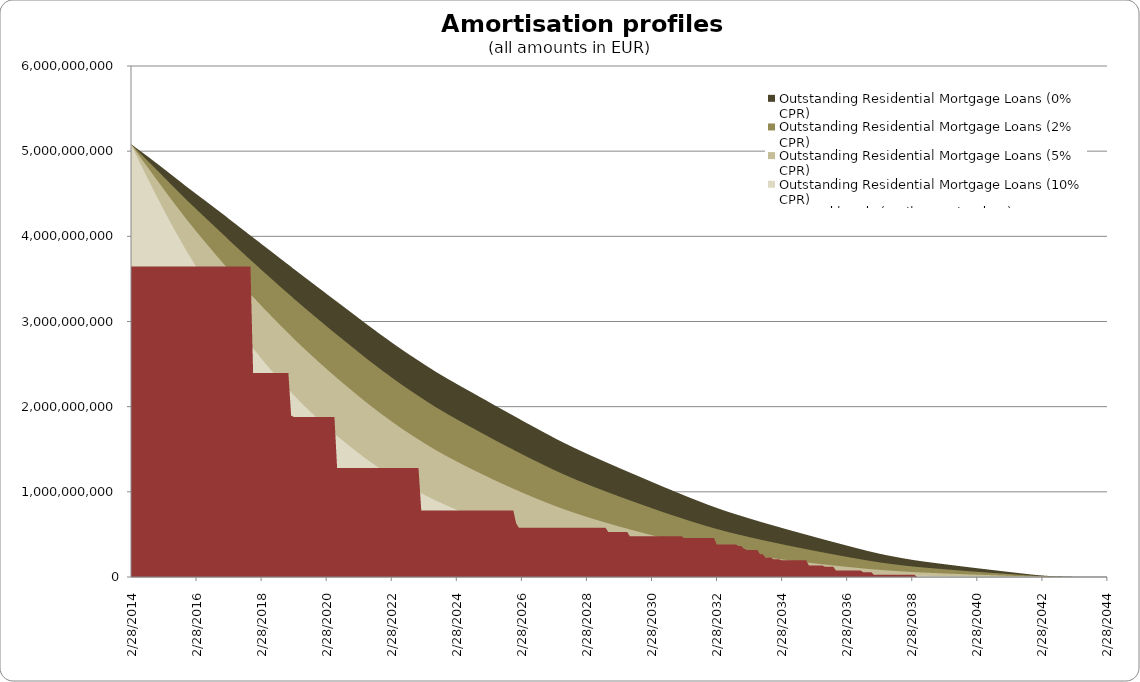
| Category | Outstanding Residential Mortgage Loans (0% CPR) | Outstanding Residential Mortgage Loans (2% CPR) | Outstanding Residential Mortgage Loans (5% CPR) | Outstanding Residential Mortgage Loans (10% CPR) | Covered bonds (until maturity date) |
|---|---|---|---|---|---|
| 2/28/14 | 5082942700.84 | 5082942700.84 | 5082942700.84 | 5082942700.84 | 3645000000 |
| 3/31/14 | 5059502535.826 | 5050991729.052 | 5037922143.529 | 5015274332.804 | 3645000000 |
| 4/30/14 | 5035281087.092 | 5018355211.27 | 4992418533.778 | 4947632926.053 | 3645000000 |
| 5/31/14 | 5011285603.222 | 4986039021.974 | 4947434528.206 | 4881010954.826 | 3645000000 |
| 6/30/14 | 4988150014.239 | 4954671481.758 | 4903588755.282 | 4816005889.536 | 3645000000 |
| 7/31/14 | 4964336653.181 | 4922723269.973 | 4859363570.341 | 4751115673.47 | 3645000000 |
| 8/31/14 | 4940842955.15 | 4891184973.503 | 4815738010.068 | 4687295189.592 | 3645000000 |
| 9/30/14 | 4917259857.171 | 4859650494.586 | 4772309431.669 | 4624143364.083 | 3645000000 |
| 10/31/14 | 4891837571.508 | 4826393687.946 | 4727386358.92 | 4560023015.857 | 3645000000 |
| 11/30/14 | 4867666459.412 | 4794467372.243 | 4683963638.098 | 4497826452.979 | 3645000000 |
| 12/31/14 | 4843360567.525 | 4762502280.533 | 4640696198.778 | 4436245375.859 | 3645000000 |
| 1/31/15 | 4818585558.343 | 4730170652.226 | 4597265071.046 | 4374971301.744 | 3645000000 |
| 2/28/15 | 4794882189.392 | 4698984526.424 | 4555138070.332 | 4315393970.453 | 3645000000 |
| 3/31/15 | 4770643957.789 | 4667366652.986 | 4512780848.197 | 4256046759.204 | 3645000000 |
| 4/30/15 | 4745654663.77 | 4635108287.786 | 4469994651.805 | 4196743173.478 | 3645000000 |
| 5/31/15 | 4720504187.506 | 4602788077.687 | 4427340178.051 | 4138009883.588 | 3645000000 |
| 6/30/15 | 4695635890.399 | 4570838167.52 | 4385231776.73 | 4080227940.161 | 3645000000 |
| 7/31/15 | 4670676207.111 | 4538893913.978 | 4343317059.092 | 4023061290.3 | 3645000000 |
| 8/31/15 | 4645601096.726 | 4506932212.853 | 4301573239.839 | 3966483747.097 | 3645000000 |
| 9/30/15 | 4620162576.696 | 4474713228.848 | 4259771442.784 | 3910280367.37 | 3645000000 |
| 10/31/15 | 4594717519.586 | 4442583564.598 | 4218241983.476 | 3854751017.992 | 3645000000 |
| 11/30/15 | 4570021427.967 | 4411272282.862 | 4177673964.944 | 3800516544.794 | 3645000000 |
| 12/31/15 | 4545985293.916 | 4380689731.853 | 4137975999.32 | 3747479735.752 | 3645000000 |
| 1/31/16 | 4522037053.219 | 4350282140.718 | 4098620341.845 | 3695151583.996 | 3645000000 |
| 2/29/16 | 4498120890.365 | 4319995262.623 | 4059554081.064 | 3643477912.199 | 3645000000 |
| 3/31/16 | 4474372137.292 | 4289958477.967 | 4020896959.711 | 3592559713.094 | 3645000000 |
| 4/30/16 | 4450592835.087 | 4259981278.537 | 3982468416.519 | 3542228995.983 | 3645000000 |
| 5/31/16 | 4426799076.137 | 4230078977.879 | 3944281659.935 | 3492492289.609 | 3645000000 |
| 6/30/16 | 4402882541.416 | 4200148103.167 | 3906239279.581 | 3443258441.138 | 3645000000 |
| 7/31/16 | 4378186574.345 | 4169563663.639 | 3867761104.014 | 3394014255.098 | 3645000000 |
| 8/31/16 | 4353879960.064 | 4139440408.961 | 3829882600.224 | 3345667085.675 | 3645000000 |
| 9/30/16 | 4329561764.112 | 4109395707.571 | 3792246714.17 | 3297897005.578 | 3645000000 |
| 10/31/16 | 4305246448.666 | 4079443100.554 | 3754864719.96 | 3250708611.803 | 3645000000 |
| 11/30/16 | 4281146619.941 | 4049783477.246 | 3717919762.633 | 3204254493.932 | 3645000000 |
| 12/31/16 | 4256918379.91 | 4020090826.008 | 3681110618.996 | 3158268866.889 | 3645000000 |
| 1/31/17 | 4232304644.921 | 3990123175.259 | 3644215909.341 | 3112558857.45 | 3645000000 |
| 2/28/17 | 4207166236.234 | 3959751149.521 | 3607119122.341 | 3067024177.801 | 3645000000 |
| 3/31/17 | 4182793767.362 | 3930189694.366 | 3570926392.227 | 3022601234.265 | 3645000000 |
| 4/30/17 | 4158247149.837 | 3900553134.858 | 3534828744.632 | 2978595833.054 | 3645000000 |
| 5/31/17 | 4133690504.04 | 3870995766.353 | 3498965580.359 | 2935121692.607 | 3645000000 |
| 6/30/17 | 4109010117.195 | 3841411120.944 | 3463239747.217 | 2892092912.744 | 3645000000 |
| 7/31/17 | 4084345184.216 | 3811929473.267 | 3427767993.637 | 2849602907.363 | 3645000000 |
| 8/31/17 | 4059751473.946 | 3782602503.872 | 3392595349.603 | 2807684021.216 | 3645000000 |
| 9/30/17 | 4034085317.271 | 3752365860.673 | 3356768003.914 | 2765545046.161 | 3645000000 |
| 10/31/17 | 4009989252.924 | 3723678225.759 | 3322485469.616 | 2724995206.285 | 3645000000 |
| 11/30/17 | 3985685824.072 | 3694884251.662 | 3288263240.714 | 2684803292.328 | 2395000000 |
| 12/31/17 | 3961289545.43 | 3666090683.344 | 3254196224.229 | 2645043830.162 | 2395000000 |
| 1/31/18 | 3936896882.748 | 3637386870.014 | 3220362957.701 | 2605776725.416 | 2395000000 |
| 2/28/18 | 3912645200.657 | 3608899287.948 | 3186873934.754 | 2567086512.239 | 2395000000 |
| 3/31/18 | 3888437018.644 | 3580537308.161 | 3153647287.61 | 2528901895.132 | 2395000000 |
| 4/30/18 | 3864256143.3 | 3552285636.8 | 3120668157.426 | 2491206304.859 | 2395000000 |
| 5/31/18 | 3839937837.99 | 3523992756.119 | 3087802474.572 | 2453888686.629 | 2395000000 |
| 6/30/18 | 3815094331.622 | 3495303834.99 | 3054739858.507 | 2416700438.041 | 2395000000 |
| 7/31/18 | 3790603362.186 | 3467023900.202 | 3022184181.423 | 2380196209.031 | 2395000000 |
| 8/31/18 | 3764578363.17 | 3437428499.917 | 2988632810.872 | 2343190689.27 | 2395000000 |
| 9/30/18 | 3740095116.616 | 3409328259.305 | 2956531422.395 | 2307601506.667 | 2395000000 |
| 10/31/18 | 3715844044.433 | 3381524115.76 | 2924832257.137 | 2272597479.662 | 2395000000 |
| 11/30/18 | 3691254161.748 | 3353496056.331 | 2893084167.699 | 2237823695.622 | 2395000000 |
| 12/31/18 | 3667078057.508 | 3325928007.285 | 2861876624.387 | 2203732865.251 | 2395000000 |
| 1/31/19 | 3642210038.876 | 3297816727.457 | 2830344983.916 | 2169654875.586 | 1895000000 |
| 2/28/19 | 3617795469.021 | 3270200491.385 | 2799381131.716 | 2136272035.649 | 1880000000 |
| 3/31/19 | 3593625821.244 | 3242888850.278 | 2768818637.533 | 2103450400.458 | 1880000000 |
| 4/30/19 | 3569445246.563 | 3215649997.045 | 2738457547.603 | 2071033009.343 | 1880000000 |
| 5/31/19 | 3545063931.704 | 3188313066.387 | 2708151733.264 | 2038906187.251 | 1880000000 |
| 6/30/19 | 3520761058.862 | 3161129434.951 | 2678114295.909 | 2007227505.615 | 1880000000 |
| 7/31/19 | 3496629896.065 | 3134182147.1 | 2648413884.282 | 1976043903.976 | 1880000000 |
| 8/31/19 | 3472239582.916 | 3107084677.333 | 2618722662.677 | 1945106937.058 | 1880000000 |
| 9/30/19 | 3448107425.959 | 3080300120.512 | 2589430412.73 | 1914703196.522 | 1880000000 |
| 10/31/19 | 3423843670.689 | 3053479519.613 | 2560241997.342 | 1884609940.689 | 1880000000 |
| 11/30/19 | 3399166313.787 | 3026372194.605 | 2530947508.038 | 1854670826.986 | 1880000000 |
| 12/31/19 | 3375014769.529 | 2999814782.603 | 2502246179.799 | 1825395520.057 | 1880000000 |
| 1/31/20 | 3351044030.438 | 2973498591.078 | 2473877127.622 | 1796587247.149 | 1880000000 |
| 2/29/20 | 3327102636.603 | 2947288441.589 | 2445726128.766 | 1768158742.318 | 1880000000 |
| 3/31/20 | 3302346153.569 | 2920437228.071 | 2417173659.703 | 1739660587.884 | 1880000000 |
| 4/30/20 | 3278440162.835 | 2894418881.009 | 2389440132.938 | 1711969675.112 | 1880000000 |
| 5/31/20 | 3254556605.46 | 2868499574.533 | 2361915497.614 | 1684641561.78 | 1880000000 |
| 6/30/20 | 3230649406.775 | 2842638478.775 | 2334565108.014 | 1657648281.463 | 1280000000 |
| 7/31/20 | 3206597381.28 | 2816729052.238 | 2307300854.356 | 1630924537.158 | 1280000000 |
| 8/31/20 | 3182398605.786 | 2790770055.616 | 2280121567.002 | 1604467352.796 | 1280000000 |
| 9/30/20 | 3158398623.847 | 2765064460.223 | 2253273984.541 | 1578447445.656 | 1280000000 |
| 10/31/20 | 3134384617.509 | 2739425190.592 | 2226603984.732 | 1552752894.655 | 1280000000 |
| 11/30/20 | 3110152779.408 | 2713674291.255 | 2199966419.227 | 1527279980.836 | 1280000000 |
| 12/31/20 | 3085563891.751 | 2687691267.496 | 2173264099.216 | 1501959960.272 | 1280000000 |
| 1/31/21 | 3061819254.018 | 2662522126.526 | 2147341640.51 | 1477373270.327 | 1280000000 |
| 2/28/21 | 3038223104.342 | 2637558963.721 | 2121704470.872 | 1453172683.2 | 1280000000 |
| 3/31/21 | 3014928299.821 | 2612933416.846 | 2096456481.455 | 1429425178.992 | 1280000000 |
| 4/30/21 | 2989462188.007 | 2586504621.737 | 2069881876.617 | 1404961359.051 | 1280000000 |
| 5/31/21 | 2965686411.513 | 2561617379.514 | 2044661211.392 | 1381603479.756 | 1280000000 |
| 6/30/21 | 2942074574.954 | 2536947910.951 | 2019730582.839 | 1358622315.545 | 1280000000 |
| 7/31/21 | 2918274824.382 | 2512192423.446 | 1994846977.726 | 1335851340.695 | 1280000000 |
| 8/31/21 | 2895220096.663 | 2488153314.951 | 1970646003.047 | 1313712711.277 | 1280000000 |
| 9/30/21 | 2870468529.755 | 2462732161.497 | 1945465149.735 | 1291095843.378 | 1280000000 |
| 10/31/21 | 2847429580.42 | 2438856366.153 | 1921619031.7 | 1269537580.558 | 1280000000 |
| 11/30/21 | 2824693596.465 | 2415312985.038 | 1898144531.926 | 1248391463.841 | 1280000000 |
| 12/31/21 | 2802379041.933 | 2392201656.568 | 1875117307.976 | 1227702661.234 | 1280000000 |
| 1/31/22 | 2779350128.97 | 2368552471.638 | 1851776039.892 | 1206969947.858 | 1280000000 |
| 2/28/22 | 2757108738.119 | 2345646076.555 | 1829122231.515 | 1186844897.894 | 1280000000 |
| 3/31/22 | 2734773352.348 | 2322730209.132 | 1806565892.395 | 1166939357.538 | 1280000000 |
| 4/30/22 | 2712216178.292 | 2299696744.119 | 1784022810.919 | 1147197327.205 | 1280000000 |
| 5/31/22 | 2690058645.309 | 2277072486.759 | 1761900921.21 | 1127878838.98 | 1280000000 |
| 6/30/22 | 2668330968.687 | 2254881087.414 | 1740215630.225 | 1108989087.091 | 1280000000 |
| 7/31/22 | 2646171528.79 | 2232393653.444 | 1718402891.334 | 1090165525.787 | 1280000000 |
| 8/31/22 | 2624544651.362 | 2210424023.485 | 1697088936.195 | 1071803802.317 | 1280000000 |
| 9/30/22 | 2603441877.818 | 2188962652.759 | 1676262990.666 | 1053891957.043 | 1280000000 |
| 10/31/22 | 2582229652.289 | 2167475357.322 | 1655513657.158 | 1036167445.052 | 1280000000 |
| 11/30/22 | 2561195493.624 | 2146203374.239 | 1635024508.001 | 1018743109.593 | 1280000000 |
| 12/31/22 | 2540643417.508 | 2125400113.653 | 1614986464.384 | 1001734304.82 | 1280000000 |
| 1/31/23 | 2519662767.846 | 2104302843.658 | 1594818349.242 | 984777517.826 | 780000000 |
| 2/28/23 | 2499634192.52 | 2084064326.345 | 1575392942.556 | 968409496.188 | 780000000 |
| 3/31/23 | 2479069593.389 | 2063441785.602 | 1555767844.287 | 952046536.246 | 780000000 |
| 4/30/23 | 2458884046.187 | 2043197698.825 | 1536518363.014 | 936039947.987 | 780000000 |
| 5/31/23 | 2438402722.308 | 2022770518.962 | 1517220752.189 | 920128843.491 | 780000000 |
| 6/30/23 | 2417724101.631 | 2002242890.644 | 1497937569.09 | 904350589.937 | 780000000 |
| 7/31/23 | 2398266609.132 | 1982788177.335 | 1479544622.579 | 889230648.355 | 780000000 |
| 8/31/23 | 2379314670.887 | 1963810517.247 | 1461591885.908 | 874491758.066 | 780000000 |
| 9/30/23 | 2360266605.316 | 1944811887.382 | 1443706580.454 | 859907576.971 | 780000000 |
| 10/31/23 | 2341621320.2 | 1926202941.099 | 1426192576.232 | 845657010.668 | 780000000 |
| 11/30/23 | 2322790578.98 | 1907498800.263 | 1408689239.66 | 831523488.579 | 780000000 |
| 12/31/23 | 2304811549.799 | 1889550391.563 | 1391823601.573 | 817874679.225 | 780000000 |
| 1/31/24 | 2286754378.044 | 1871593013.921 | 1375029221.824 | 804373467.369 | 780000000 |
| 2/29/24 | 2268565148.986 | 1853582803.402 | 1358273721.466 | 790999754.918 | 780000000 |
| 3/31/24 | 2250588193.029 | 1835801039.574 | 1341762693.006 | 777871760.408 | 780000000 |
| 4/30/24 | 2232686392.896 | 1818135055.144 | 1325412419.143 | 764938588.578 | 780000000 |
| 5/31/24 | 2214888149.722 | 1800607496.6 | 1309238425.564 | 752207258.858 | 780000000 |
| 6/30/24 | 2197090020.425 | 1783133853.104 | 1293178360.201 | 739640099.36 | 780000000 |
| 7/31/24 | 2179260914.022 | 1765688801.798 | 1277213323.594 | 727224834.775 | 780000000 |
| 8/31/24 | 2161500091.079 | 1748352628.025 | 1261400800.561 | 714992696.004 | 780000000 |
| 9/30/24 | 2143520998.561 | 1730893530.009 | 1245573099.631 | 702847275.607 | 780000000 |
| 10/31/24 | 2125434240.894 | 1713401427.244 | 1229795174.522 | 690824564.98 | 780000000 |
| 11/30/24 | 2107519888.553 | 1696102024.729 | 1214228512.842 | 679013887.543 | 780000000 |
| 12/31/24 | 2089820379.288 | 1679028585.78 | 1198895523.897 | 667425522.839 | 780000000 |
| 1/31/25 | 2072129812.764 | 1662014959.801 | 1183676353.775 | 655990703.577 | 780000000 |
| 2/28/25 | 2054420003.67 | 1645038414.665 | 1168554256.278 | 644698761.677 | 780000000 |
| 3/31/25 | 2035940185.854 | 1627498746.539 | 1153103511.493 | 633314587.594 | 780000000 |
| 4/30/25 | 2018150069.58 | 1610563841.774 | 1138152274.516 | 622292848.45 | 780000000 |
| 5/31/25 | 2000501343.421 | 1593793950.933 | 1123387000.769 | 611458624.967 | 780000000 |
| 6/30/25 | 1982792479.576 | 1577028090.337 | 1108693351.331 | 600748045.747 | 780000000 |
| 7/31/25 | 1965008016.169 | 1560254098.887 | 1094062520.003 | 590155292.519 | 780000000 |
| 8/31/25 | 1947198450.454 | 1543512178.313 | 1079522410.527 | 579694354.006 | 780000000 |
| 9/30/25 | 1929452175.376 | 1526872252.966 | 1065121373.061 | 569389886.356 | 780000000 |
| 10/31/25 | 1912011580.57 | 1510525434.806 | 1050991571.55 | 559310696.219 | 780000000 |
| 11/30/25 | 1894635936.759 | 1494280517.378 | 1036998478.241 | 549383044.929 | 780000000 |
| 12/31/25 | 1876485153.189 | 1477475662.711 | 1022683183.143 | 539363421.146 | 630000000 |
| 1/31/26 | 1858864656.873 | 1461139941.29 | 1008758914.811 | 529628080.515 | 578000000 |
| 2/28/26 | 1841623131.024 | 1445152381.822 | 995139603.994 | 520128760.857 | 578000000 |
| 3/31/26 | 1823747326.84 | 1428717582.768 | 981276845.765 | 510577476.115 | 578000000 |
| 4/30/26 | 1806662937.492 | 1412952935.725 | 967938250.29 | 501373060.618 | 578000000 |
| 5/31/26 | 1789627155.983 | 1397275232.709 | 954721518.842 | 492303922.47 | 578000000 |
| 6/30/26 | 1772244446.357 | 1381375862.823 | 941415638.481 | 483260429.049 | 578000000 |
| 7/31/26 | 1754787177.816 | 1365468013.368 | 928166458.973 | 474317272.02 | 578000000 |
| 8/31/26 | 1737621322.164 | 1349836151.019 | 915166656.858 | 465571621.085 | 578000000 |
| 9/30/26 | 1720167455.332 | 1334029655.964 | 902109823.394 | 456866132.769 | 578000000 |
| 10/31/26 | 1702636958.425 | 1318213190.341 | 889107707.968 | 448257093.625 | 578000000 |
| 11/30/26 | 1685725541.178 | 1302924658.759 | 876521998.043 | 439925217.233 | 578000000 |
| 12/31/26 | 1668904397.624 | 1287753487.547 | 864074215.48 | 431728107.587 | 578000000 |
| 1/31/27 | 1651499690.415 | 1272180140.004 | 851415823.366 | 423491051.626 | 578000000 |
| 2/28/27 | 1635210937.046 | 1257513736.295 | 839422560.769 | 415648675.666 | 578000000 |
| 3/31/27 | 1618400880.98 | 1242492854.604 | 827249653.078 | 407779698.248 | 578000000 |
| 4/30/27 | 1602451065.658 | 1228178269.748 | 815603156.452 | 400231389.471 | 578000000 |
| 5/31/27 | 1586547228.333 | 1213943508.472 | 804064262.879 | 392795271.721 | 578000000 |
| 6/30/27 | 1570591693.53 | 1199713672.505 | 792582877.069 | 385445888.789 | 578000000 |
| 7/31/27 | 1555063479.054 | 1185854138.92 | 781399529.178 | 378298934.979 | 578000000 |
| 8/31/27 | 1538672708.318 | 1171381179.114 | 769865588.33 | 371039480.502 | 578000000 |
| 9/30/27 | 1523477015.05 | 1157861829.321 | 759011221.63 | 364163702.143 | 578000000 |
| 10/31/27 | 1508321758.362 | 1144415328.315 | 748255503.866 | 357389362.385 | 578000000 |
| 11/30/27 | 1493421520.896 | 1131203955.915 | 737703702.282 | 350765529.371 | 578000000 |
| 12/31/27 | 1478384272.683 | 1117930185.434 | 727160910.597 | 344198292.699 | 578000000 |
| 1/31/28 | 1463989745.72 | 1105183069.707 | 717009416.727 | 337867399.038 | 578000000 |
| 2/29/28 | 1449399223.801 | 1092327964.593 | 706835709.941 | 331576050.027 | 578000000 |
| 3/31/28 | 1435212835.621 | 1079817041.575 | 696931993.206 | 325460520.839 | 578000000 |
| 4/30/28 | 1420763958.819 | 1067147959.842 | 686972982.26 | 319367568.777 | 578000000 |
| 5/31/28 | 1406695784.94 | 1054803913.394 | 677269541.934 | 313441099.851 | 578000000 |
| 6/30/28 | 1392659507.438 | 1042522252.876 | 667651671.847 | 307600884.779 | 578000000 |
| 7/31/28 | 1378140878.819 | 1029918454.218 | 657873270.018 | 301733216.591 | 578000000 |
| 8/31/28 | 1363895347.786 | 1017557857.359 | 648295948.459 | 296003898.255 | 578000000 |
| 9/30/28 | 1349858810.084 | 1005391592.149 | 638887275.807 | 290396651.154 | 578000000 |
| 10/31/28 | 1336036095.98 | 993422368.918 | 629647840.83 | 284910414.919 | 528000000 |
| 11/30/28 | 1322299420.188 | 981554436.337 | 620515976.509 | 279516092.999 | 528000000 |
| 12/31/28 | 1308137885.102 | 969408773.633 | 611252034.196 | 274105284.249 | 528000000 |
| 1/31/29 | 1294443915.779 | 957647105.891 | 602273376.691 | 268864832.004 | 528000000 |
| 2/28/29 | 1280742190.677 | 945916536.659 | 593356599.217 | 263693456.877 | 528000000 |
| 3/31/29 | 1267137061.067 | 934293944.602 | 584549491.718 | 258611662.743 | 528000000 |
| 4/30/29 | 1253536650.896 | 922711251.794 | 575808887.888 | 253599518.771 | 528000000 |
| 5/31/29 | 1239658908.402 | 910961085.222 | 567005364.166 | 248599625.603 | 528000000 |
| 6/30/29 | 1226065720.919 | 899456591.862 | 558396060.332 | 243724332.579 | 478000000 |
| 7/31/29 | 1212474014.567 | 887989310.815 | 549850556.468 | 238915571.135 | 478000000 |
| 8/31/29 | 1198916812.26 | 876583290.363 | 541383372.096 | 234178997.039 | 478000000 |
| 9/30/29 | 1185377569.398 | 865226240.049 | 532986490.702 | 229510454.383 | 478000000 |
| 10/31/29 | 1171853889.079 | 853916258.124 | 524658358.057 | 224908624.839 | 478000000 |
| 11/30/29 | 1158075812.004 | 842456813.403 | 516278161.079 | 220321312.931 | 478000000 |
| 12/31/29 | 1144166937.719 | 830938515.382 | 507901845.541 | 215772348.951 | 478000000 |
| 1/31/30 | 1130816408.033 | 819861393.361 | 499834388.223 | 211390454.366 | 478000000 |
| 2/28/30 | 1117524496.002 | 808861614.081 | 491852310.483 | 207079543.156 | 478000000 |
| 3/31/30 | 1104266525.516 | 797921047.353 | 483944105.807 | 202834081.604 | 478000000 |
| 4/30/30 | 1090779276.904 | 786849605.857 | 475994363.389 | 198605274.102 | 478000000 |
| 5/31/30 | 1076809036.856 | 775465327.6 | 467893764.063 | 194347727.187 | 478000000 |
| 6/30/30 | 1063395730.308 | 764517524.302 | 460094574.104 | 190249079.227 | 478000000 |
| 7/31/30 | 1050204535.131 | 753763773.592 | 452449093.671 | 186246626.613 | 478000000 |
| 8/31/30 | 1037143344.453 | 743137190.24 | 444916232.75 | 182322466.314 | 478000000 |
| 9/30/30 | 1024105369.285 | 732560831.472 | 437449317.249 | 178456726.437 | 478000000 |
| 10/31/30 | 1010470789.805 | 721591907.496 | 429784251.389 | 174541586.265 | 478000000 |
| 11/30/30 | 997572063.888 | 711182413.003 | 422488260.918 | 170807253.563 | 478000000 |
| 12/31/30 | 984732745.974 | 700848179.057 | 415271743.793 | 167134953.883 | 478000000 |
| 1/31/31 | 971624542.978 | 690355652.411 | 407996193.939 | 163468568.406 | 478000000 |
| 2/28/31 | 958916423.003 | 680180230.199 | 400942436.845 | 159920233.256 | 458000000 |
| 3/31/31 | 945700739.029 | 669677666.583 | 393730112.124 | 156337536.035 | 458000000 |
| 4/30/31 | 933073290.108 | 659624358.131 | 386815878.331 | 152901648.882 | 458000000 |
| 5/31/31 | 920497479.865 | 649639420.189 | 379974780.893 | 149522272.905 | 458000000 |
| 6/30/31 | 907873004.336 | 639651920.887 | 373165001.978 | 146182459.157 | 458000000 |
| 7/31/31 | 895402958.375 | 629804806.194 | 366469606.806 | 142914258.858 | 458000000 |
| 8/31/31 | 883011075.593 | 620043895.097 | 359856392.849 | 139704392.898 | 458000000 |
| 9/30/31 | 870541209.783 | 610259374.036 | 353261281.541 | 136527495.032 | 458000000 |
| 10/31/31 | 858344482.185 | 600697166.551 | 346826249.052 | 133437925.913 | 458000000 |
| 11/30/31 | 846223035.55 | 591217998.06 | 340469972.711 | 130403540.133 | 458000000 |
| 12/31/31 | 834262600.805 | 581881322.802 | 334226115.737 | 127436603.939 | 458000000 |
| 1/31/32 | 822781397.533 | 572908077.966 | 328220501.067 | 124584139.094 | 458000000 |
| 2/29/32 | 811693216.087 | 564236578.863 | 322416151.831 | 121830796.189 | 383000000 |
| 3/31/32 | 800666382.326 | 555635205.043 | 316679609.973 | 119125198.072 | 383000000 |
| 4/30/32 | 789094456.119 | 546683532.889 | 310771463.766 | 116377201.748 | 383000000 |
| 5/31/32 | 777990675.17 | 538084189.574 | 305091540.618 | 113736585.386 | 383000000 |
| 6/30/32 | 767538565.852 | 529962189.311 | 299708882.108 | 111227679.342 | 383000000 |
| 7/31/32 | 757181827.031 | 521931730.854 | 294403672.521 | 108767645.246 | 383000000 |
| 8/31/32 | 747024748.448 | 514064185.709 | 289215566.954 | 106370551.172 | 383000000 |
| 9/30/32 | 736985917.804 | 506302867.324 | 284111948.596 | 104023744.891 | 383000000 |
| 10/31/32 | 727030568.231 | 498623459.795 | 279078650.416 | 101721520.093 | 363000000 |
| 11/30/32 | 717163533.698 | 491028923.135 | 274116877.123 | 99463845.09 | 363000000 |
| 12/31/32 | 707377523.706 | 483513908.743 | 269223190.658 | 97249007.779 | 333000000 |
| 1/31/33 | 697660456.832 | 476069832.76 | 264392391 | 95074687.572 | 318000000 |
| 2/28/33 | 688017232.231 | 468699736.996 | 259625767.748 | 92940924.779 | 318000000 |
| 3/31/33 | 678414867.339 | 461380876.8 | 254910349.834 | 90842673.348 | 318000000 |
| 4/30/33 | 668854217.112 | 454113635.233 | 250246041.147 | 88779541.149 | 318000000 |
| 5/31/33 | 659347674.134 | 446906210.895 | 245637041.902 | 86752656.148 | 318000000 |
| 6/30/33 | 649711732.082 | 439634190.77 | 241014805.735 | 84737546.847 | 268000000 |
| 7/31/33 | 640351605.434 | 432571690.057 | 236529410.643 | 82786696.991 | 268000000 |
| 8/31/33 | 631089902.746 | 425598081.557 | 232114094.407 | 80876092.706 | 228000000 |
| 9/30/33 | 621885070.674 | 418684998.824 | 227752968.189 | 78999789.99 | 228000000 |
| 10/31/33 | 612741296.192 | 411835007.207 | 223447087.853 | 77157799.449 | 228000000 |
| 11/30/33 | 603673043.539 | 405057550.448 | 219201218.967 | 75351402.573 | 208000000 |
| 12/31/33 | 594682662.126 | 398353892.557 | 215015660.076 | 73580326.631 | 208000000 |
| 1/31/34 | 585726585.913 | 391694582.175 | 210874169.908 | 71838664.062 | 208000000 |
| 2/28/34 | 576791618.083 | 385070640.886 | 206771664.051 | 70124394.982 | 196000000 |
| 3/31/34 | 567865529.825 | 378473794.044 | 202703488.478 | 68435677.182 | 196000000 |
| 4/30/34 | 558951227.723 | 371905893.329 | 198670444.508 | 66772533.332 | 196000000 |
| 5/31/34 | 550037808.312 | 365359604.364 | 194668429.552 | 65133341.463 | 196000000 |
| 6/30/34 | 541172482.637 | 358866179.058 | 190713888.917 | 63523350.408 | 196000000 |
| 7/31/34 | 532333946.122 | 352411300.108 | 186798941.471 | 61939647.098 | 196000000 |
| 8/31/34 | 523528336.406 | 345998883.351 | 182925426.637 | 60382575.671 | 196000000 |
| 9/30/34 | 514760374.479 | 339631881.986 | 179094655.289 | 58852297.778 | 196000000 |
| 10/31/34 | 506007267.472 | 333295106.54 | 175298381.281 | 57345843.597 | 196000000 |
| 11/30/34 | 497286213.252 | 326999765.729 | 171542290.147 | 55864830.847 | 196000000 |
| 12/31/34 | 488599840.399 | 320747428.265 | 167826964.388 | 54409190.766 | 136000000 |
| 1/31/35 | 479937877.204 | 314531196.92 | 164148560.574 | 52977425.202 | 136000000 |
| 2/28/35 | 471313662.371 | 308359668.475 | 160511338.258 | 51570664.439 | 136000000 |
| 3/31/35 | 462697154.97 | 302213046.779 | 156904770.913 | 50185286.007 | 136000000 |
| 4/30/35 | 454096370.824 | 296096484.319 | 153331358.953 | 48821877.963 | 136000000 |
| 5/31/35 | 445522303.879 | 290017036.317 | 149794558.661 | 47481319.002 | 136000000 |
| 6/30/35 | 436576023.727 | 283715315.253 | 146160527.341 | 46121144.993 | 121000000 |
| 7/31/35 | 428040680.532 | 277700578.532 | 142691761.541 | 44824155.964 | 121000000 |
| 8/31/35 | 419531179.245 | 271722011.649 | 139258505.452 | 43549000.686 | 121000000 |
| 9/30/35 | 411035891.776 | 265771962.793 | 135856639.312 | 42294176.423 | 121000000 |
| 10/31/35 | 402568736.749 | 259859322.447 | 132490518.508 | 41060832.025 | 77000000 |
| 11/30/35 | 394125071.726 | 253980959.407 | 129158339.042 | 39848193.521 | 77000000 |
| 12/31/35 | 385710967.525 | 248140654.813 | 125861821.009 | 38656580.717 | 77000000 |
| 1/31/36 | 377325912.941 | 242337937.366 | 122600513.388 | 37485642.427 | 77000000 |
| 2/29/36 | 368981484.192 | 236580087.726 | 119377880.609 | 36336222.458 | 77000000 |
| 3/31/36 | 360650259.485 | 230849375.107 | 116184762.123 | 35205322.647 | 77000000 |
| 4/30/36 | 352342250.354 | 225152108.192 | 113024158.213 | 34093664.279 | 77000000 |
| 5/31/36 | 344050711.946 | 219483862.561 | 109893663.493 | 33000330.716 | 77000000 |
| 6/30/36 | 335776722.751 | 213845225.902 | 106793399.185 | 31925175.339 | 77000000 |
| 7/31/36 | 327524282.06 | 208238638.59 | 103724407.056 | 30868326.432 | 77000000 |
| 8/31/36 | 319331823.095 | 202688380.311 | 100698567.151 | 29833118.928 | 57000000 |
| 9/30/36 | 311172456.939 | 197177174.992 | 97707043.705 | 28816715.669 | 57000000 |
| 10/31/36 | 303255606.722 | 191837351.279 | 94815032.203 | 27838065.315 | 57000000 |
| 11/30/36 | 295551267.097 | 186649140.89 | 92012073.522 | 26893660.063 | 57000000 |
| 12/31/36 | 288146067.778 | 181666440.247 | 89324033.051 | 25990621.155 | 25000000 |
| 1/31/37 | 280997050.82 | 176861217.404 | 86736326.025 | 25124220.567 | 25000000 |
| 2/28/37 | 273895771.529 | 172101642.502 | 84183741.018 | 24275212.415 | 25000000 |
| 3/31/37 | 267188302.784 | 167604613.243 | 81771877.381 | 23473725.741 | 25000000 |
| 4/30/37 | 260541850.3 | 163160436.826 | 79397651.126 | 22689710.414 | 25000000 |
| 5/31/37 | 254169290.87 | 158901970.545 | 77125301.186 | 21941252.485 | 25000000 |
| 6/30/37 | 247954319.011 | 154755724.413 | 74918505.845 | 21217630.845 | 25000000 |
| 7/31/37 | 241795157.208 | 150657751.942 | 72745923.504 | 20509717.84 | 25000000 |
| 8/31/37 | 235748474.09 | 146643093.656 | 70624207.441 | 19822017.429 | 25000000 |
| 9/30/37 | 229773152.757 | 142685830.158 | 68540554.605 | 19150720.753 | 25000000 |
| 10/31/37 | 223875002.635 | 138789306.665 | 66496313.483 | 18496021.462 | 25000000 |
| 11/30/37 | 218063845.771 | 134959328.393 | 64493993.006 | 17858429.364 | 25000000 |
| 12/31/37 | 212586868.556 | 131348318.009 | 62605958.207 | 17257699.523 | 25000000 |
| 1/31/38 | 207340011.888 | 127891016.619 | 60800336.776 | 16684625.461 | 25000000 |
| 2/28/38 | 202276591.762 | 124557931.458 | 59062540.966 | 16134884.025 | 25000000 |
| 3/31/38 | 197346447.146 | 121317628.374 | 57377212.543 | 15604016.818 | 25000000 |
| 4/30/38 | 192562495.339 | 118177594.1 | 55747509.822 | 15092656.135 | 0 |
| 5/31/38 | 187928827.058 | 115139855.837 | 54173987.581 | 14600719.218 | 0 |
| 6/30/38 | 183454518.354 | 112209474.95 | 52658616.721 | 14128502.618 | 0 |
| 7/31/38 | 179128653.885 | 109379269.763 | 51197615.011 | 13674758.463 | 0 |
| 8/31/38 | 174983035.223 | 106668144.844 | 49799415.723 | 13241507.323 | 0 |
| 9/30/38 | 170881238.566 | 103992500.038 | 48424630.92 | 12818072.893 | 0 |
| 10/31/38 | 166801410.35 | 101338901.812 | 47066866.706 | 12402663.15 | 0 |
| 11/30/38 | 162745795.839 | 98708622.894 | 45726607.488 | 11995321.285 | 0 |
| 12/31/38 | 158568065.075 | 96012964.83 | 44362760.564 | 11585231.311 | 0 |
| 1/31/39 | 154559728.304 | 93428491.923 | 43056905.679 | 11193662.356 | 0 |
| 2/28/39 | 150567892.196 | 90862399.914 | 41765960.614 | 10809238.566 | 0 |
| 3/31/39 | 146582340.538 | 88308462.603 | 40486980.583 | 10431127.697 | 0 |
| 4/30/39 | 142601302.01 | 85765574.786 | 39219392.529 | 10059119.658 | 0 |
| 5/31/39 | 138621507.471 | 83231738.916 | 37962221.9 | 9692905.414 | 0 |
| 6/30/39 | 134646917.064 | 80709304.37 | 36716481.243 | 9332685.894 | 0 |
| 7/31/39 | 130692962.049 | 78207468.854 | 35486279.879 | 8979441.229 | 0 |
| 8/31/39 | 126759794.648 | 75726240.351 | 34271525.203 | 8633074.941 | 0 |
| 9/30/39 | 122834479.011 | 73257820.959 | 33068601.379 | 8292608.251 | 0 |
| 10/31/39 | 118928973.877 | 70809286.711 | 31880626.285 | 7958759.994 | 0 |
| 11/30/39 | 115050570.302 | 68384891.684 | 30709417.763 | 7631912.601 | 0 |
| 12/31/39 | 111201571.684 | 65985901.178 | 29555435.729 | 7312104.939 | 0 |
| 1/31/40 | 107375146.682 | 63608160.499 | 28416713.276 | 6998776.701 | 0 |
| 2/29/40 | 103570982.53 | 61251397.463 | 27293033.291 | 6691806.006 | 0 |
| 3/31/40 | 99776627.077 | 58908174.306 | 26180995.821 | 6390295.454 | 0 |
| 4/30/40 | 95988730.782 | 56576468.24 | 25079635.806 | 6093955.057 | 0 |
| 5/31/40 | 92217622.666 | 54262318.388 | 23991562.461 | 5803363.811 | 0 |
| 6/30/40 | 88456633.049 | 51961737.802 | 22914935.993 | 5518018.534 | 0 |
| 7/31/40 | 84710761.542 | 49677609.323 | 21850957.033 | 5238153.388 | 0 |
| 8/31/40 | 80974693.177 | 47406757.526 | 20798155.522 | 4963360.418 | 0 |
| 9/30/40 | 77241265.954 | 45144948.666 | 19754613.039 | 4693131.893 | 0 |
| 10/31/40 | 73513797.752 | 42894091.98 | 18721111.805 | 4427607.463 | 0 |
| 11/30/40 | 69793824.729 | 40655046.052 | 17697968.198 | 4166814.104 | 0 |
| 12/31/40 | 66082125.877 | 38428223.155 | 16685301.237 | 3910731.553 | 0 |
| 1/31/41 | 62373748.254 | 36210705.057 | 15681785.985 | 3659002.627 | 0 |
| 2/28/41 | 58679952.077 | 34008989.487 | 14690178.206 | 3412223.78 | 0 |
| 3/31/41 | 54996348.022 | 31820475.758 | 13709284.829 | 3170067.32 | 0 |
| 4/30/41 | 51325277.427 | 29646468.151 | 12739602.78 | 2932599.887 | 0 |
| 5/31/41 | 47666237.358 | 27486621.85 | 11780916.719 | 2699723.307 | 0 |
| 6/30/41 | 44006918.905 | 25333797.723 | 10830108.595 | 2470678.424 | 0 |
| 7/31/41 | 40364190.476 | 23197672.989 | 9891262.515 | 2246354.952 | 0 |
| 8/31/41 | 36744592.226 | 21081933.874 | 8965872.273 | 2027040.563 | 0 |
| 9/30/41 | 33161193.076 | 18993981.089 | 8056991.336 | 1813368.344 | 0 |
| 10/31/41 | 29724697.069 | 16996994.393 | 7191240.615 | 1611239.867 | 0 |
| 11/30/41 | 26470789.907 | 15110903.572 | 6376713.679 | 1422317.445 | 0 |
| 12/31/41 | 23445842.222 | 13361592.125 | 5623924.585 | 1248769.682 | 0 |
| 1/31/42 | 20605292.501 | 11723033.227 | 4921483.883 | 1087882.937 | 0 |
| 2/28/42 | 18014198.649 | 10231634.059 | 4284260.444 | 942768.799 | 0 |
| 3/31/42 | 15539492.79 | 8811213.613 | 3679945.53 | 806146.494 | 0 |
| 4/30/42 | 13249230.349 | 7499950.221 | 3124200.049 | 681325.52 | 0 |
| 5/31/42 | 11162527.154 | 6308107.682 | 2620923.512 | 569001.494 | 0 |
| 6/30/42 | 9241569.362 | 5213761.209 | 2160633.873 | 466964.088 | 0 |
| 7/31/42 | 7502278.369 | 4225396.057 | 1746514.762 | 375766.279 | 0 |
| 8/31/42 | 5960365.601 | 3351320.688 | 1381642.298 | 295926.871 | 0 |
| 9/30/42 | 4604761.408 | 2584753.068 | 1062853.696 | 226623.798 | 0 |
| 10/31/42 | 3486477.793 | 1953744.055 | 801303.226 | 170087.408 | 0 |
| 11/30/42 | 2624194.684 | 1468066.259 | 600550.693 | 126901.919 | 0 |
| 12/31/42 | 1989222.803 | 1110968.829 | 453294.745 | 95354.774 | 0 |
| 1/31/43 | 1500082.016 | 836377.399 | 340373.62 | 71278.884 | 0 |
| 2/28/43 | 1108248.682 | 616869.57 | 250392.748 | 52199.938 | 0 |
| 3/31/43 | 793826.034 | 441113.451 | 178588.502 | 37063.376 | 0 |
| 4/30/43 | 541116.397 | 300181.896 | 121216.707 | 25043.626 | 0 |
| 5/31/43 | 343788.445 | 190394.289 | 76684.342 | 15771.924 | 0 |
| 6/30/43 | 194741.434 | 107668.793 | 43253.118 | 8856.021 | 0 |
| 7/31/43 | 104961.012 | 57933.308 | 23212.969 | 4731.46 | 0 |
| 8/31/43 | 65118.819 | 35881.92 | 14340.122 | 2909.783 | 0 |
| 9/30/43 | 38122.2 | 20970.846 | 8359.261 | 1688.569 | 0 |
| 10/31/43 | 18454.512 | 10134.665 | 4029.361 | 810.271 | 0 |
| 11/30/43 | 5813.786 | 3187.386 | 1263.969 | 253.031 | 0 |
| 12/31/43 | 0 | 0 | 0 | 0 | 0 |
| 1/31/44 | 0 | 0 | 0 | 0 | 0 |
| 2/29/44 | 0 | 0 | 0 | 0 | 0 |